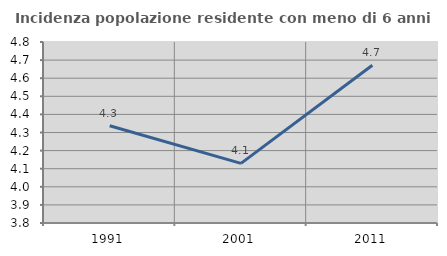
| Category | Incidenza popolazione residente con meno di 6 anni |
|---|---|
| 1991.0 | 4.337 |
| 2001.0 | 4.129 |
| 2011.0 | 4.671 |